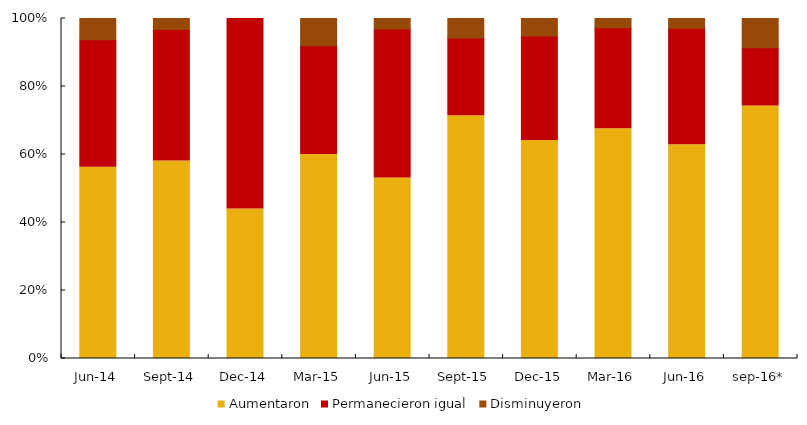
| Category | Aumentaron | Permanecieron igual | Disminuyeron |
|---|---|---|---|
| jun-14 | 56.25 | 37.5 | 6.25 |
| sep-14 | 58.065 | 38.7 | 3.226 |
| dic-14 | 44 | 56 | 0 |
| mar-15 | 60 | 32 | 8 |
| jun-15 | 53.1 | 43.8 | 3.1 |
| sep-15 | 71.4 | 22.9 | 5.7 |
| dic-15 | 64.103 | 30.769 | 5.128 |
| mar-16 | 67.568 | 29.73 | 2.703 |
| jun-16 | 62.857 | 34.286 | 2.857 |
| sep-16* | 74.286 | 17.143 | 8.571 |